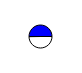
| Category | Series 0 |
|---|---|
| 0 | 4218991 |
| 1 | 4242931 |